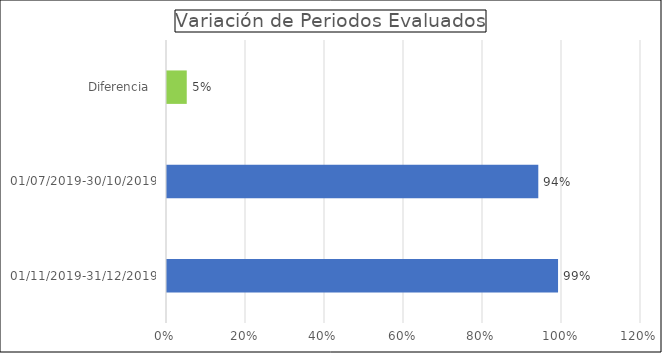
| Category | Calificación Total |
|---|---|
| 01/11/2019-31/12/2019 | 0.99 |
| 01/07/2019-30/10/2019 | 0.94 |
| Diferencia  | 0.05 |